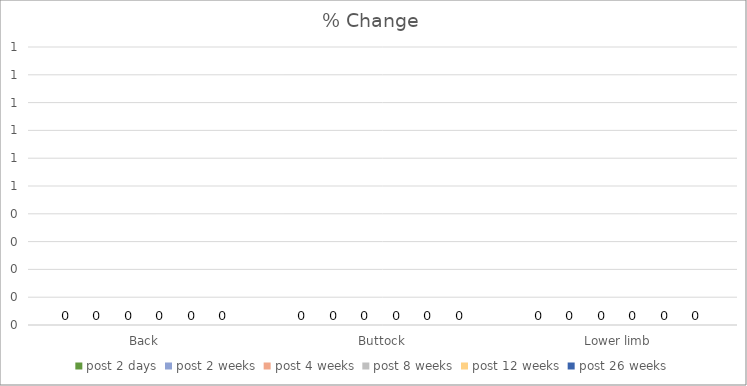
| Category | post 2 days | post 2 weeks | post 4 weeks | post 8 weeks | post 12 weeks | post 26 weeks |
|---|---|---|---|---|---|---|
| Back | 0 | 0 | 0 | 0 | 0 | 0 |
| Buttock | 0 | 0 | 0 | 0 | 0 | 0 |
| Lower limb | 0 | 0 | 0 | 0 | 0 | 0 |